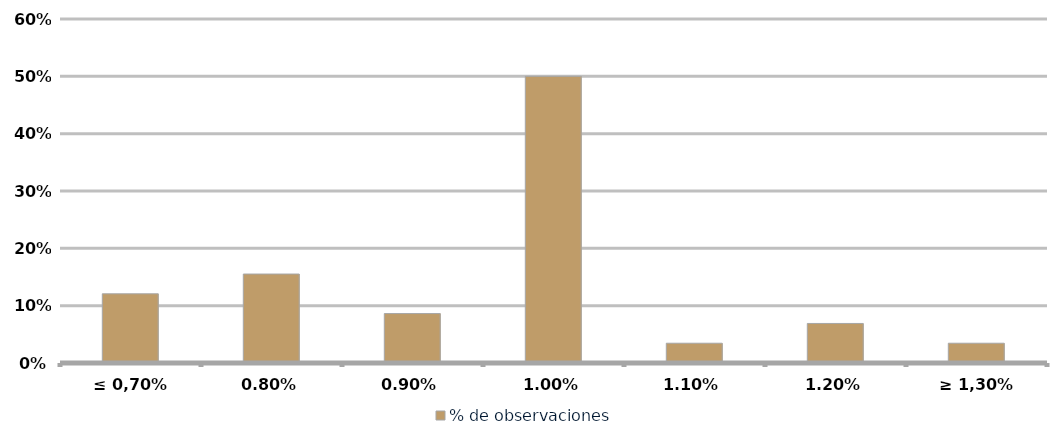
| Category | % de observaciones  |
|---|---|
| ≤ 0,70% | 0.121 |
| 0,80% | 0.155 |
| 0,90% | 0.086 |
| 1,00% | 0.5 |
| 1,10% | 0.034 |
| 1,20% | 0.069 |
| ≥ 1,30% | 0.034 |